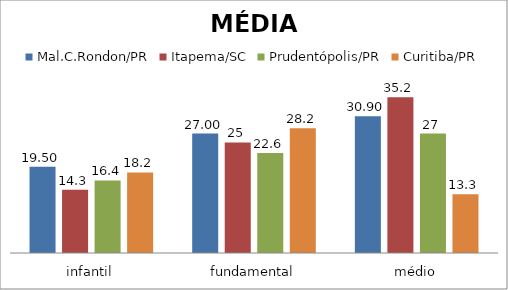
| Category | Mal.C.Rondon/PR | Itapema/SC | Prudentópolis/PR | Toledo/PR | Cascavel/PR | Curitiba/PR |
|---|---|---|---|---|---|---|
| infantil | 19.5 | 14.3 | 16.4 |  |  | 18.2 |
| fundamental | 27 | 25 | 22.6 |  |  | 28.2 |
| médio | 30.9 | 35.2 | 27 |  |  | 13.3 |